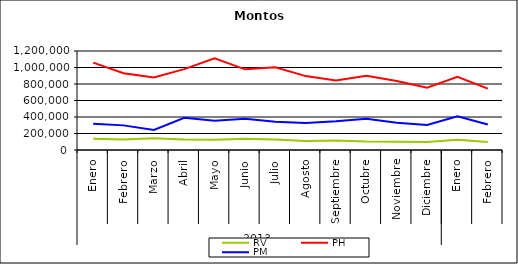
| Category | RV | PH | PM |
|---|---|---|---|
| 0 | 136808.804 | 1058774.967 | 316751.291 |
| 1 | 127193.421 | 930111.334 | 298480.292 |
| 2 | 142052.509 | 880100.908 | 242691.68 |
| 3 | 126637.277 | 980038.371 | 389833.89 |
| 4 | 123189.846 | 1112542.201 | 355777.139 |
| 5 | 135184.022 | 977877.296 | 379782.022 |
| 6 | 127790.361 | 1003315.643 | 342842.568 |
| 7 | 110532.346 | 895717.973 | 326616.455 |
| 8 | 114630.859 | 843607.598 | 348985.725 |
| 9 | 102262.08 | 901170.281 | 379642.157 |
| 10 | 99242.352 | 837424.505 | 330278.777 |
| 11 | 96243.301 | 754952.55 | 304473.582 |
| 12 | 124770.971 | 885857.327 | 408057.686 |
| 13 | 96987.292 | 744736.746 | 309218.036 |